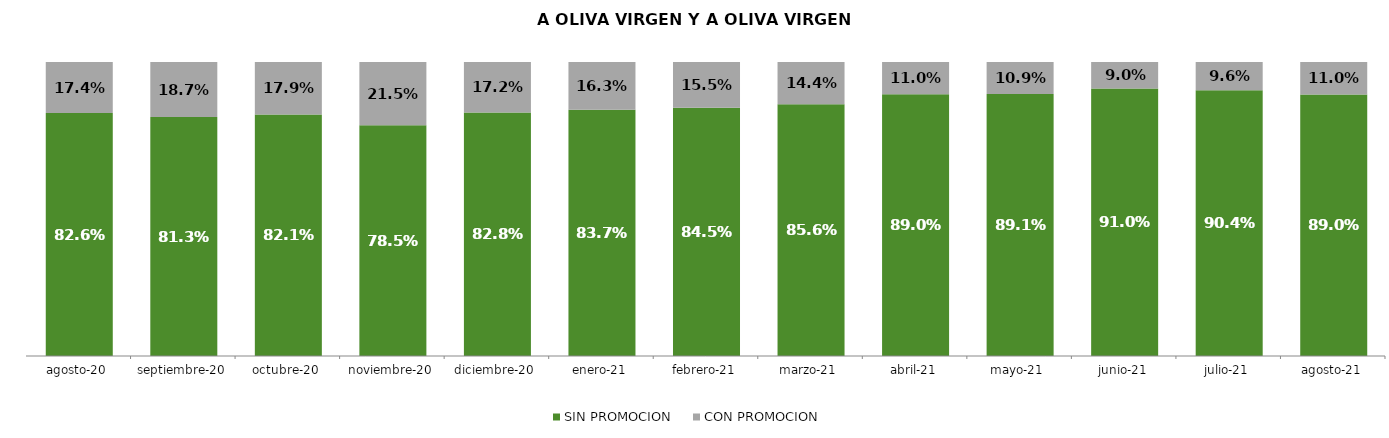
| Category | SIN PROMOCION   | CON PROMOCION   |
|---|---|---|
| 2020-08-01 | 0.826 | 0.174 |
| 2020-09-01 | 0.813 | 0.187 |
| 2020-10-01 | 0.821 | 0.179 |
| 2020-11-01 | 0.785 | 0.215 |
| 2020-12-01 | 0.828 | 0.172 |
| 2021-01-01 | 0.837 | 0.163 |
| 2021-02-01 | 0.845 | 0.155 |
| 2021-03-01 | 0.856 | 0.144 |
| 2021-04-01 | 0.89 | 0.11 |
| 2021-05-01 | 0.891 | 0.109 |
| 2021-06-01 | 0.91 | 0.09 |
| 2021-07-01 | 0.904 | 0.096 |
| 2021-08-01 | 0.89 | 0.11 |